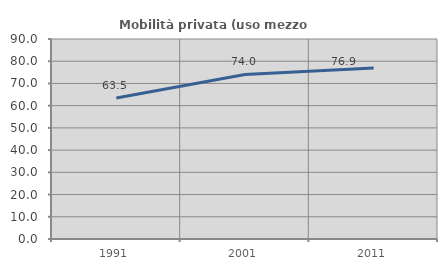
| Category | Mobilità privata (uso mezzo privato) |
|---|---|
| 1991.0 | 63.478 |
| 2001.0 | 74.037 |
| 2011.0 | 76.946 |